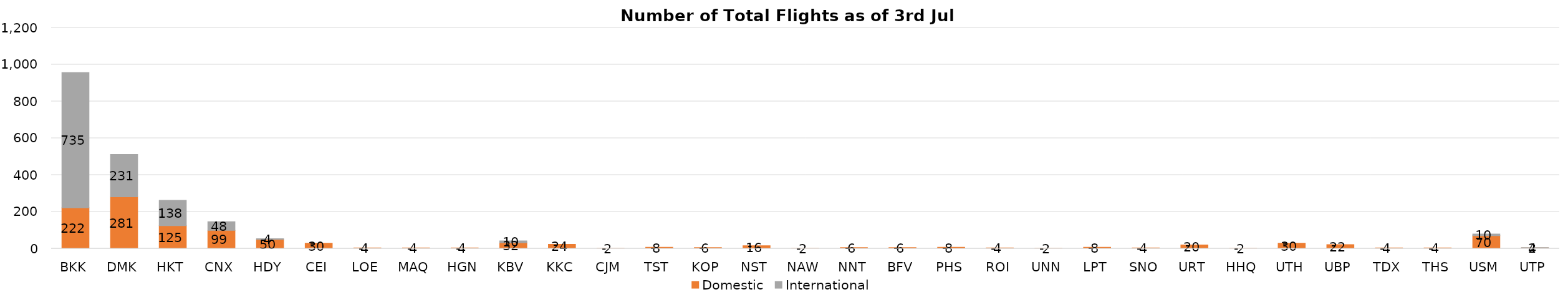
| Category | Domestic | International |
|---|---|---|
| BKK | 222 | 735 |
| DMK | 281 | 231 |
| HKT | 125 | 138 |
| CNX | 99 | 48 |
| HDY | 50 | 4 |
| CEI | 30 | 0 |
| LOE | 4 | 0 |
| MAQ | 4 | 0 |
| HGN | 4 | 0 |
| KBV | 32 | 10 |
| KKC | 24 | 0 |
| CJM | 2 | 0 |
| TST | 8 | 0 |
| KOP | 6 | 0 |
| NST | 16 | 0 |
| NAW | 2 | 0 |
| NNT | 6 | 0 |
| BFV | 6 | 0 |
| PHS | 8 | 0 |
| ROI | 4 | 0 |
| UNN | 2 | 0 |
| LPT | 8 | 0 |
| SNO | 4 | 0 |
| URT | 20 | 0 |
| HHQ | 2 | 0 |
| UTH | 30 | 0 |
| UBP | 22 | 0 |
| TDX | 4 | 0 |
| THS | 4 | 0 |
| USM | 70 | 10 |
| UTP | 4 | 2 |